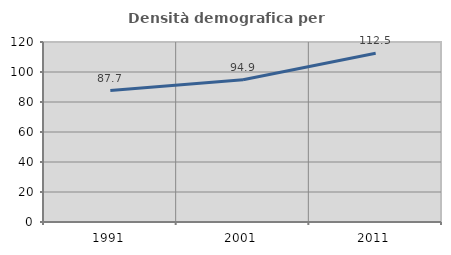
| Category | Densità demografica |
|---|---|
| 1991.0 | 87.656 |
| 2001.0 | 94.855 |
| 2011.0 | 112.452 |